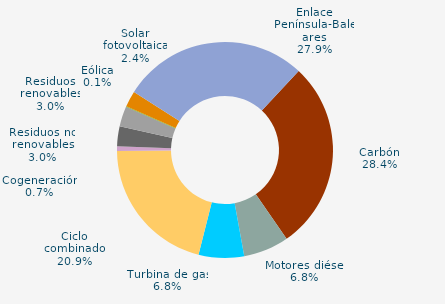
| Category | Series 0 |
|---|---|
| Carbón | 28.4 |
| Motores diésel | 6.8 |
| Turbina de gas | 6.8 |
| Ciclo combinado | 20.9 |
| Generación auxiliar | 0 |
| Cogeneración | 0.7 |
| Residuos no renovables | 3 |
| Residuos renovables | 3 |
| Eólica | 0.1 |
| Solar fotovoltaica | 2.4 |
| Otras renovables | 0 |
| Enlace Península-Baleares | 27.9 |